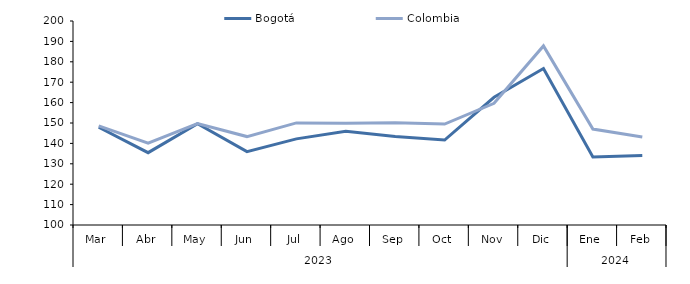
| Category | Bogotá | Colombia |
|---|---|---|
| 0 | 147.928 | 148.628 |
| 1 | 135.458 | 140.105 |
| 2 | 149.623 | 149.727 |
| 3 | 135.941 | 143.346 |
| 4 | 142.221 | 150.043 |
| 5 | 145.99 | 149.874 |
| 6 | 143.355 | 150.127 |
| 7 | 141.637 | 149.482 |
| 8 | 162.619 | 159.642 |
| 9 | 176.679 | 187.795 |
| 10 | 133.287 | 147.039 |
| 11 | 134.07 | 143.136 |